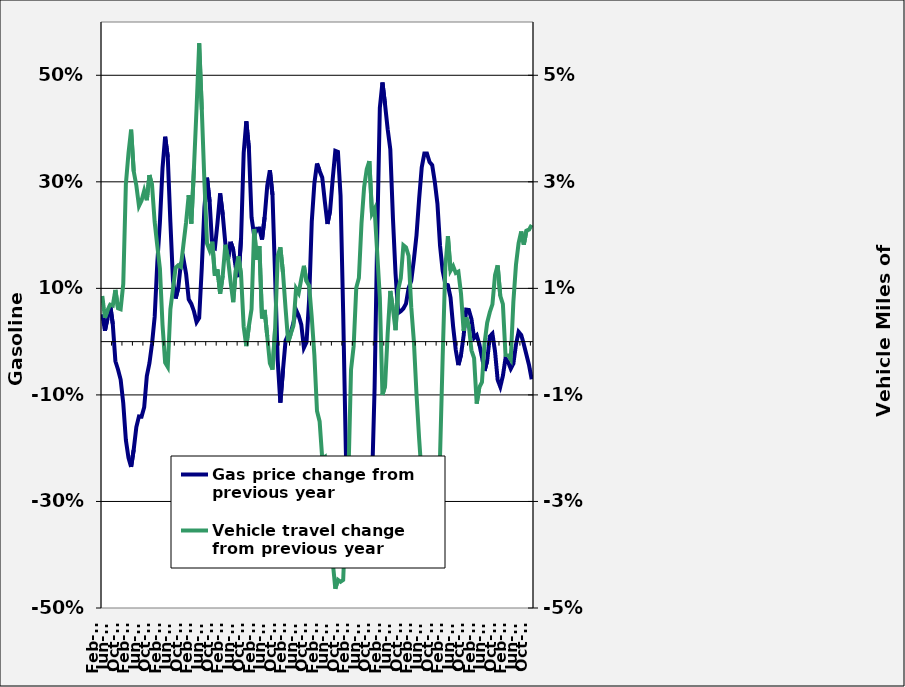
| Category | Gas price change from previous year |
|---|---|
| 2001-02-01 | 0.051 |
| 2001-03-01 | 0.021 |
| 2001-04-01 | 0.044 |
| 2001-05-01 | 0.069 |
| 2001-06-01 | 0.033 |
| 2001-07-01 | -0.037 |
| 2001-08-01 | -0.052 |
| 2001-09-01 | -0.071 |
| 2001-10-01 | -0.115 |
| 2001-11-01 | -0.185 |
| 2001-12-01 | -0.218 |
| 2002-01-01 | -0.235 |
| 2002-02-01 | -0.202 |
| 2002-03-01 | -0.16 |
| 2002-04-01 | -0.14 |
| 2002-05-01 | -0.141 |
| 2002-06-01 | -0.123 |
| 2002-07-01 | -0.065 |
| 2002-08-01 | -0.04 |
| 2002-09-01 | -0.003 |
| 2002-10-01 | 0.046 |
| 2002-11-01 | 0.148 |
| 2002-12-01 | 0.224 |
| 2003-01-01 | 0.326 |
| 2003-02-01 | 0.385 |
| 2003-03-01 | 0.347 |
| 2003-04-01 | 0.224 |
| 2003-05-01 | 0.114 |
| 2003-06-01 | 0.081 |
| 2003-07-01 | 0.101 |
| 2003-08-01 | 0.146 |
| 2003-09-01 | 0.155 |
| 2003-10-01 | 0.127 |
| 2003-11-01 | 0.079 |
| 2003-12-01 | 0.071 |
| 2004-01-01 | 0.057 |
| 2004-02-01 | 0.037 |
| 2004-03-01 | 0.045 |
| 2004-04-01 | 0.139 |
| 2004-05-01 | 0.252 |
| 2004-06-01 | 0.308 |
| 2004-07-01 | 0.262 |
| 2004-08-01 | 0.177 |
| 2004-09-01 | 0.175 |
| 2004-10-01 | 0.223 |
| 2004-11-01 | 0.278 |
| 2004-12-01 | 0.238 |
| 2005-01-01 | 0.184 |
| 2005-02-01 | 0.154 |
| 2005-03-01 | 0.187 |
| 2005-04-01 | 0.173 |
| 2005-05-01 | 0.138 |
| 2005-06-01 | 0.121 |
| 2005-07-01 | 0.194 |
| 2005-08-01 | 0.354 |
| 2005-09-01 | 0.414 |
| 2005-10-01 | 0.362 |
| 2005-11-01 | 0.233 |
| 2005-12-01 | 0.199 |
| 2006-01-01 | 0.212 |
| 2006-02-01 | 0.212 |
| 2006-03-01 | 0.192 |
| 2006-04-01 | 0.233 |
| 2006-05-01 | 0.293 |
| 2006-06-01 | 0.322 |
| 2006-07-01 | 0.276 |
| 2006-08-01 | 0.124 |
| 2006-09-01 | -0.036 |
| 2006-10-01 | -0.114 |
| 2006-11-01 | -0.053 |
| 2006-12-01 | 0.002 |
| 2007-01-01 | 0.013 |
| 2007-02-01 | 0.017 |
| 2007-03-01 | 0.035 |
| 2007-04-01 | 0.06 |
| 2007-05-01 | 0.049 |
| 2007-06-01 | 0.032 |
| 2007-07-01 | -0.011 |
| 2007-08-01 | -0.001 |
| 2007-09-01 | 0.08 |
| 2007-10-01 | 0.225 |
| 2007-11-01 | 0.298 |
| 2007-12-01 | 0.334 |
| 2008-01-01 | 0.32 |
| 2008-02-01 | 0.308 |
| 2008-03-01 | 0.262 |
| 2008-04-01 | 0.221 |
| 2008-05-01 | 0.246 |
| 2008-06-01 | 0.305 |
| 2008-07-01 | 0.358 |
| 2008-08-01 | 0.356 |
| 2008-09-01 | 0.274 |
| 2008-10-01 | 0.054 |
| 2008-11-01 | -0.201 |
| 2008-12-01 | -0.384 |
| 2009-01-01 | -0.406 |
| 2009-02-01 | -0.393 |
| 2009-03-01 | -0.39 |
| 2009-04-01 | -0.401 |
| 2009-05-01 | -0.385 |
| 2009-06-01 | -0.376 |
| 2009-07-01 | -0.346 |
| 2009-08-01 | -0.329 |
| 2009-09-01 | -0.268 |
| 2009-10-01 | -0.087 |
| 2009-11-01 | 0.199 |
| 2009-12-01 | 0.439 |
| 2010-01-10 | 0.486 |
| 2010-02-10 | 0.445 |
| 2010-03-10 | 0.399 |
| 2010-04-10 | 0.361 |
| 2010-05-10 | 0.232 |
| 2010-06-10 | 0.127 |
| 2010-07-10 | 0.054 |
| 2010-08-10 | 0.057 |
| 2010-09-10 | 0.062 |
| 2010-10-10 | 0.071 |
| 2010-11-10 | 0.101 |
| 2010-12-10 | 0.114 |
| 2011-01-01 | 0.154 |
| 2011-02-01 | 0.199 |
| 2011-03-01 | 0.267 |
| 2011-04-01 | 0.327 |
| 2011-05-01 | 0.353 |
| 2011-06-01 | 0.353 |
| 2011-07-01 | 0.337 |
| 2011-08-01 | 0.331 |
| 2011-09-01 | 0.3 |
| 2011-10-01 | 0.259 |
| 2011-11-01 | 0.18 |
| 2011-12-01 | 0.133 |
| 2012-01-01 | 0.109 |
| 2012-02-01 | 0.106 |
| 2012-03-01 | 0.083 |
| 2012-04-01 | 0.028 |
| 2012-05-12 | -0.016 |
| 2012-06-12 | -0.044 |
| 2012-07-12 | -0.025 |
| 2012-08-12 | 0.011 |
| 2012-09-12 | 0.06 |
| 2012-10-12 | 0.059 |
| 2012-11-12 | 0.042 |
| 2012-12-12 | 0.007 |
| 2013-01-12 | 0.012 |
| 2013-02-12 | -0.005 |
| 2013-03-12 | -0.029 |
| 2013-04-12 | -0.055 |
| 2013-05-12 | -0.036 |
| 2013-06-12 | 0.01 |
| 2013-07-12 | 0.015 |
| 2013-08-12 | -0.018 |
| 2013-09-12 | -0.072 |
| 2013-10-12 | -0.085 |
| 2013-11-12 | -0.064 |
| 2013-12-12 | -0.031 |
| 2014-01-12 | -0.038 |
| 2014-02-12 | -0.051 |
| 2014-03-12 | -0.041 |
| 2014-04-12 | -0.005 |
| 2014-05-12 | 0.018 |
| 2014-06-12 | 0.012 |
| 2014-07-12 | -0.005 |
| 2014-08-12 | -0.025 |
| 2014-09-12 | -0.044 |
| 2014-10-12 | -0.071 |